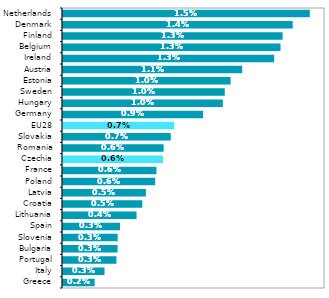
| Category | 2018 |
|---|---|
| Greece | 0.002 |
| Italy | 0.003 |
| Portugal | 0.003 |
| Bulgaria | 0.003 |
| Slovenia | 0.003 |
| Spain | 0.003 |
| Lithuania | 0.004 |
| Croatia | 0.005 |
| Latvia | 0.005 |
| Poland | 0.006 |
| France | 0.006 |
| Czechia | 0.006 |
| Romania | 0.006 |
| Slovakia | 0.007 |
| EU28 | 0.007 |
| Germany | 0.009 |
| Hungary | 0.01 |
| Sweden | 0.01 |
| Estonia | 0.01 |
| Austria | 0.011 |
| Ireland | 0.013 |
| Belgium | 0.013 |
| Finland | 0.013 |
| Denmark | 0.014 |
| Netherlands | 0.015 |